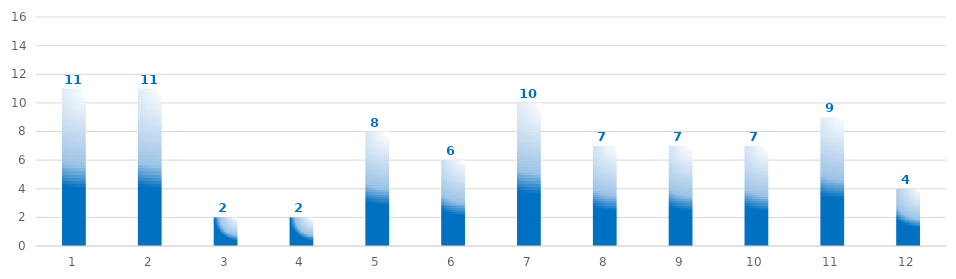
| Category | Series 0 |
|---|---|
| 0 | 11 |
| 1 | 11 |
| 2 | 2 |
| 3 | 2 |
| 4 | 8 |
| 5 | 6 |
| 6 | 10 |
| 7 | 7 |
| 8 | 7 |
| 9 | 7 |
| 10 | 9 |
| 11 | 4 |